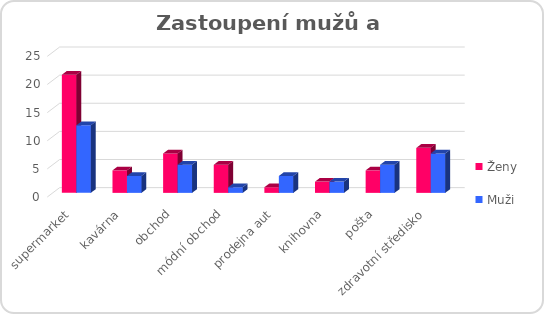
| Category | Ženy | Muži |
|---|---|---|
| supermarket | 21 | 12 |
| kavárna | 4 | 3 |
| obchod | 7 | 5 |
| módní obchod | 5 | 1 |
| prodejna aut | 1 | 3 |
| knihovna | 2 | 2 |
| pošta | 4 | 5 |
| zdravotní středisko | 8 | 7 |